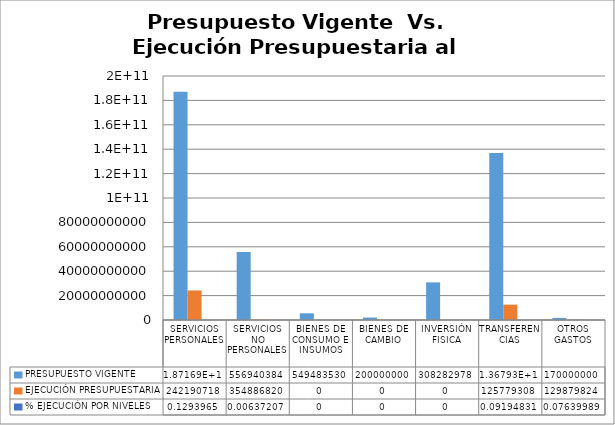
| Category | PRESUPUESTO VIGENTE | EJECUCIÓN PRESUPUESTARIA | % EJECUCIÓN POR NIVELES |
|---|---|---|---|
| SERVICIOS PERSONALES | 187169451235 | 24219071864 | 0.129 |
| SERVICIOS NO PERSONALES | 55694038462 | 354886820 | 0.006 |
| BIENES DE CONSUMO E INSUMOS | 5494835306 | 0 | 0 |
| BIENES DE CAMBIO | 2000000000 | 0 | 0 |
| INVERSIÓN FISICA | 30828297854 | 0 | 0 |
| TRANSFERENCIAS | 136793493119 | 12577930831 | 0.092 |
| OTROS GASTOS | 1700000000 | 129879824 | 0.076 |